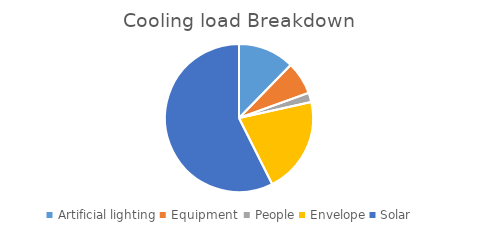
| Category | Series 0 |
|---|---|
| Artificial lighting | 12 |
| Equipment  | 7 |
| People | 2 |
| Envelope | 20.561 |
| Solar  | 56.003 |